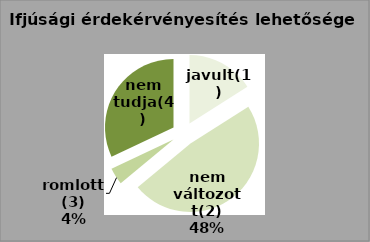
| Category | Series 0 | Series 1 |
|---|---|---|
| javult(1) | 4 | 16 |
| nem változott(2) | 12 | 48 |
| romlott(3) | 1 | 4 |
| nem tudja(4) | 8 | 32 |